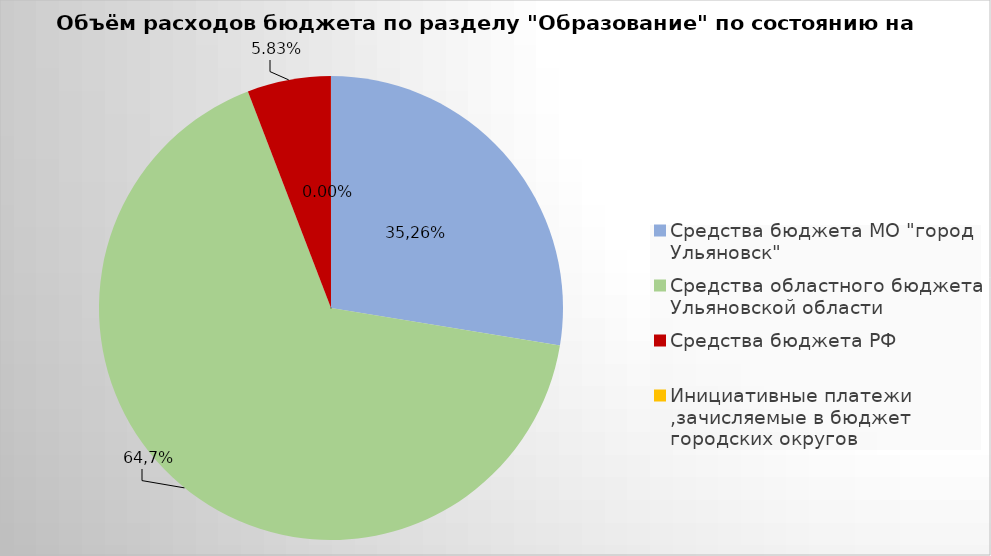
| Category | Series 0 |
|---|---|
| Средства бюджета МО "город Ульяновск" | 1902783.75 |
| Средства областного бюджета Ульяновской области | 4592243.24 |
| Средства бюджета РФ | 401928.3 |
| Инициативные платежи ,зачисляемые в бюджет городских округов | 200 |